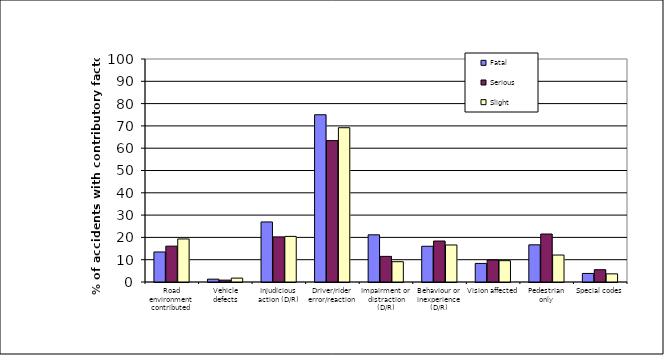
| Category | Fatal | Serious | Slight |
|---|---|---|---|
| Road environment contributed | 13.462 | 16.08 | 19.302 |
| Vehicle defects | 1.282 | 0.842 | 1.746 |
| Injudicious action (D/R) | 26.923 | 20.214 | 20.455 |
| Driver/rider error/reaction | 75 | 63.4 | 69.186 |
| Impairment or distraction (D/R) | 21.154 | 11.485 | 9.107 |
| Behaviour or inexperience (D/R) | 16.026 | 18.377 | 16.601 |
| Vision affected | 8.333 | 9.877 | 9.569 |
| Pedestrian only | 16.667 | 21.516 | 12.088 |
| Special codes | 3.846 | 5.513 | 3.656 |